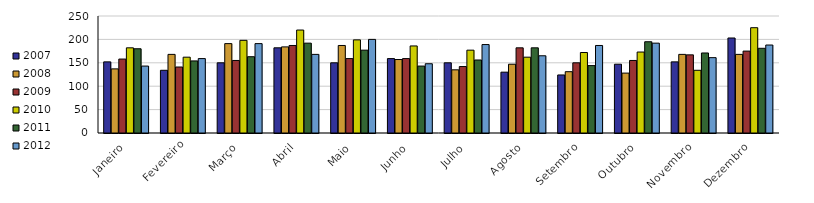
| Category | 2007 | 2008 | 2009 | 2010 | 2011 | 2012 |
|---|---|---|---|---|---|---|
| Janeiro | 152 | 137 | 158 | 182 | 180 | 143 |
| Fevereiro | 134 | 168 | 141 | 162 | 154 | 159 |
| Março | 150 | 191 | 155 | 198 | 163 | 191 |
| Abril | 182 | 184 | 187 | 220 | 192 | 168 |
| Maio | 150 | 187 | 159 | 199 | 177 | 200 |
| Junho | 159 | 157 | 159 | 186 | 143 | 148 |
| Julho | 150 | 135 | 142 | 177 | 156 | 189 |
| Agosto | 130 | 147 | 182 | 162 | 182 | 165 |
| Setembro | 124 | 131 | 150 | 172 | 144 | 187 |
| Outubro | 147 | 128 | 155 | 173 | 195 | 192 |
| Novembro | 152 | 168 | 167 | 134 | 171 | 161 |
| Dezembro | 203 | 168 | 175 | 225 | 181 | 188 |